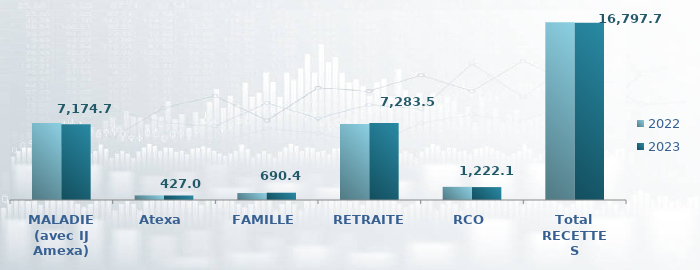
| Category | 2022 | 2023 |
|---|---|---|
| MALADIE (avec IJ Amexa) | 7293.362 | 7174.658 |
| Atexa | 437.877 | 427.03 |
| FAMILLE | 660.461 | 690.398 |
| RETRAITE | 7204.572 | 7283.46 |
| RCO | 1246.973 | 1222.141 |
| Total RECETTES | 16843.245 | 16797.686 |